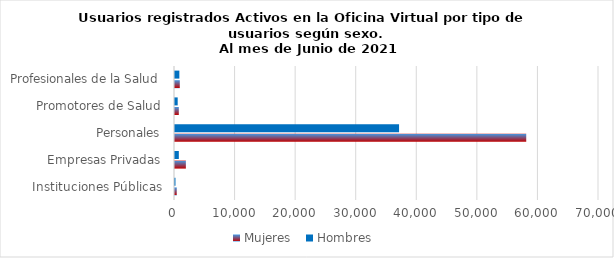
| Category | Mujeres | Hombres |
|---|---|---|
| Instituciones Públicas | 290 | 78 |
| Empresas Privadas | 1795 | 632 |
| Personales | 57987 | 36992 |
| Promotores de Salud | 629 | 443 |
| Profesionales de la Salud | 791 | 719 |